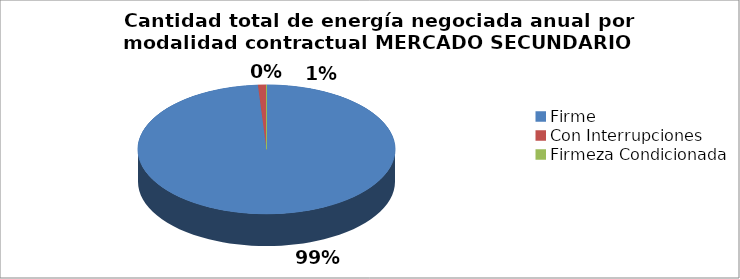
| Category | N° Contratos |
|---|---|
| Firme | 7219052 |
| Con Interrupciones | 77154 |
| Firmeza Condicionada | 122 |